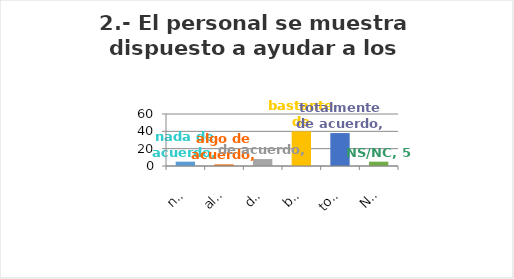
| Category | Series 0 |
|---|---|
| nada de acuerdo | 5 |
| algo de acuerdo | 2 |
| de acuerdo | 8 |
| bastante de acuerdo | 40 |
| totalmente de acuerdo | 38 |
| NS/NC | 5 |